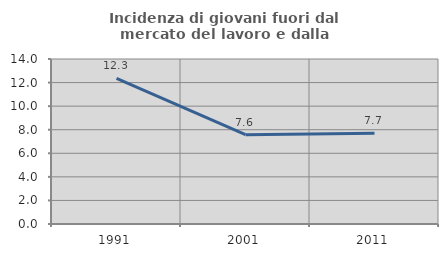
| Category | Incidenza di giovani fuori dal mercato del lavoro e dalla formazione  |
|---|---|
| 1991.0 | 12.346 |
| 2001.0 | 7.576 |
| 2011.0 | 7.692 |